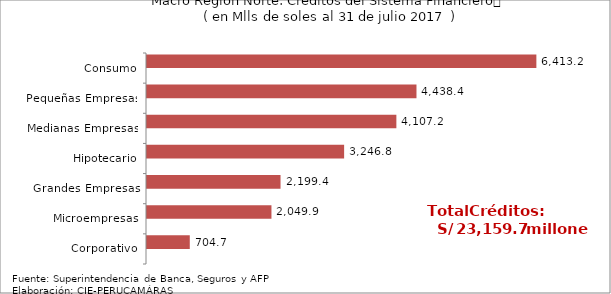
| Category | Series 0 | Series 1 |
|---|---|---|
| Corporativo |  | 704.681 |
| Microempresas |  | 2049.866 |
| Grandes Empresas |  | 2199.404 |
| Hipotecario |  | 3246.823 |
| Medianas Empresas |  | 4107.239 |
| Pequeñas Empresas |  | 4438.447 |
| Consumo |  | 6413.194 |